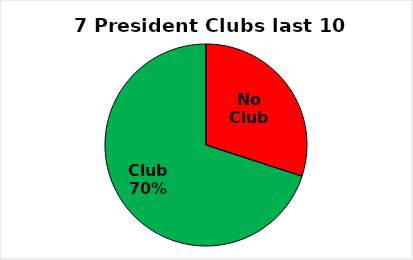
| Category | Series 0 |
|---|---|
| No Club | 0.3 |
| Club | 0.7 |